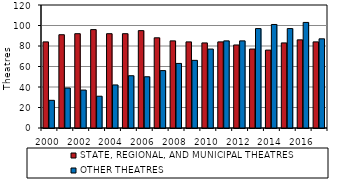
| Category | STATE, REGIONAL, AND MUNICIPAL THEATRES | OTHER THEATRES |
|---|---|---|
| 2000.0 | 84 | 27 |
| 2001.0 | 91 | 39 |
| 2002.0 | 92 | 37 |
| 2003.0 | 96 | 31 |
| 2004.0 | 92 | 42 |
| 2005.0 | 92 | 51 |
| 2006.0 | 95 | 50 |
| 2007.0 | 88 | 56 |
| 2008.0 | 85 | 63 |
| 2009.0 | 84 | 66 |
| 2010.0 | 83 | 77 |
| 2011.0 | 84 | 85 |
| 2012.0 | 81 | 85 |
| 2013.0 | 77 | 97 |
| 2014.0 | 76 | 101 |
| 2015.0 | 83 | 97 |
| 2016.0 | 86 | 103 |
| 2017.0 | 84 | 87 |